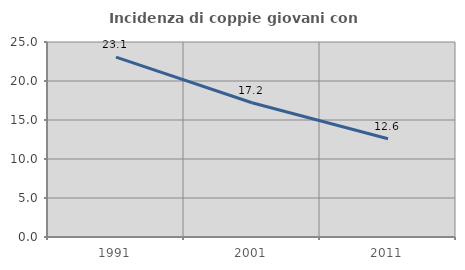
| Category | Incidenza di coppie giovani con figli |
|---|---|
| 1991.0 | 23.06 |
| 2001.0 | 17.206 |
| 2011.0 | 12.593 |